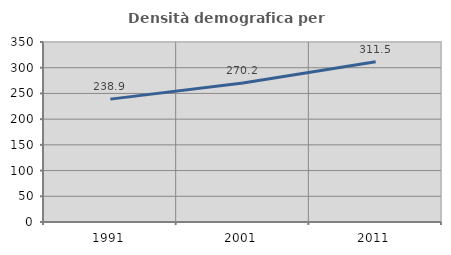
| Category | Densità demografica |
|---|---|
| 1991.0 | 238.925 |
| 2001.0 | 270.151 |
| 2011.0 | 311.452 |